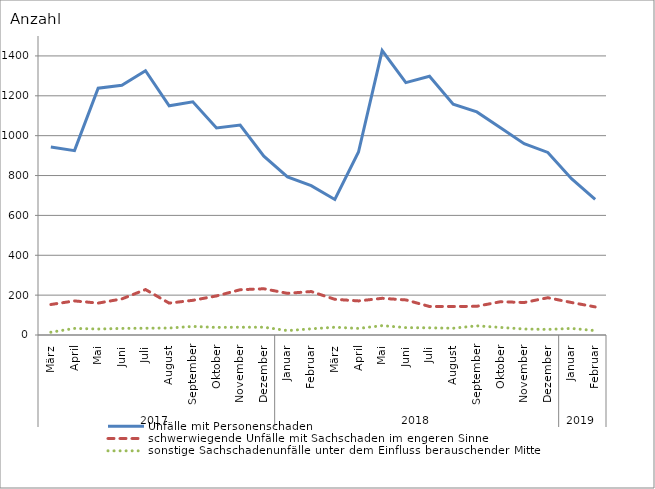
| Category | Unfälle mit Personenschaden | schwerwiegende Unfälle mit Sachschaden im engeren Sinne | sonstige Sachschadenunfälle unter dem Einfluss berauschender Mittel |
|---|---|---|---|
| 0 | 943 | 153 | 14 |
| 1 | 925 | 171 | 33 |
| 2 | 1238 | 160 | 30 |
| 3 | 1253 | 181 | 33 |
| 4 | 1326 | 228 | 34 |
| 5 | 1150 | 160 | 35 |
| 6 | 1170 | 174 | 43 |
| 7 | 1039 | 196 | 38 |
| 8 | 1053 | 227 | 39 |
| 9 | 897 | 232 | 39 |
| 10 | 793 | 209 | 22 |
| 11 | 749 | 218 | 31 |
| 12 | 680 | 179 | 39 |
| 13 | 918 | 171 | 33 |
| 14 | 1427 | 184 | 47 |
| 15 | 1266 | 176 | 37 |
| 16 | 1298 | 143 | 36 |
| 17 | 1158 | 143 | 34 |
| 18 | 1119 | 144 | 46 |
| 19 | 1040 | 167 | 38 |
| 20 | 960 | 163 | 30 |
| 21 | 916 | 187 | 28 |
| 22 | 784 | 163 | 33 |
| 23 | 680 | 141 | 22 |